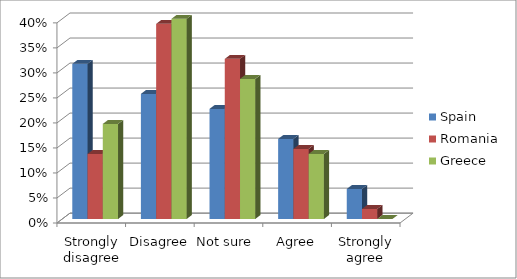
| Category | Spain | Romania | Greece |
|---|---|---|---|
| Strongly disagree | 0.31 | 0.13 | 0.19 |
| Disagree | 0.25 | 0.39 | 0.4 |
| Not sure  | 0.22 | 0.32 | 0.28 |
| Agree | 0.16 | 0.14 | 0.13 |
| Strongly agree | 0.06 | 0.02 | 0 |